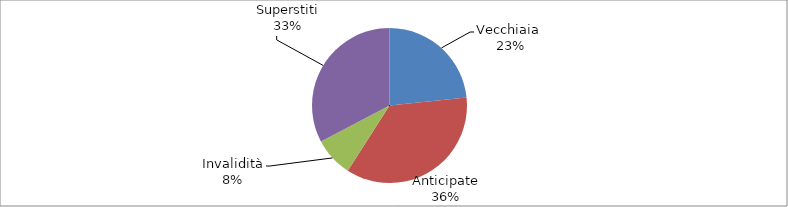
| Category | Series 0 |
|---|---|
| Vecchiaia  | 79829 |
| Anticipate | 121945 |
| Invalidità | 28132 |
| Superstiti | 111741 |